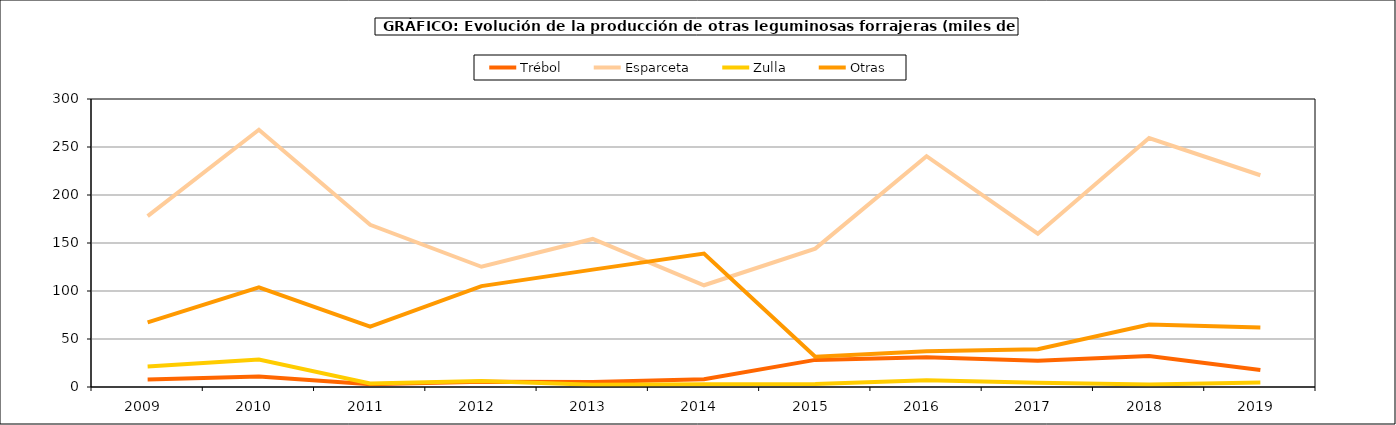
| Category | Trébol | Esparceta | Zulla | Otras |
|---|---|---|---|---|
| 2009.0 | 7.859 | 178.059 | 21.305 | 67.327 |
| 2010.0 | 10.903 | 268.016 | 28.537 | 103.706 |
| 2011.0 | 2.955 | 168.906 | 3.64 | 62.873 |
| 2012.0 | 5.531 | 125.242 | 6.24 | 105.056 |
| 2013.0 | 5.243 | 154.216 | 2.307 | 122.265 |
| 2014.0 | 8 | 105.99 | 2.813 | 139.025 |
| 2015.0 | 28.241 | 144.128 | 3.1 | 31.635 |
| 2016.0 | 30.989 | 240.408 | 6.945 | 37.171 |
| 2017.0 | 27.256 | 159.694 | 4.469 | 39.33 |
| 2018.0 | 32.363 | 259.362 | 2.725 | 65.063 |
| 2019.0 | 17.749 | 220.568 | 4.575 | 62.006 |